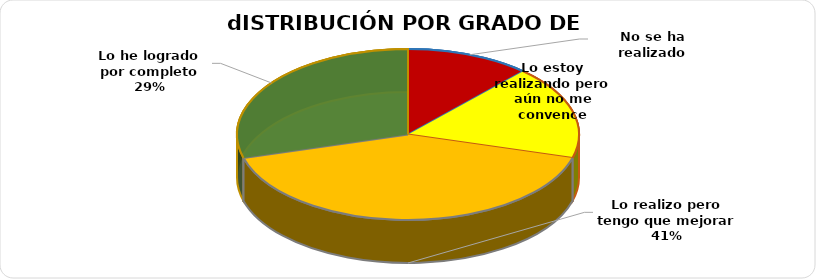
| Category | ACCIÓN |
|---|---|
| No se ha realizado | 2 |
| Lo estoy realizando pero aún no me convence | 3 |
| Lo realizo pero tengo que mejorar | 7 |
| Lo he logrado por completo | 5 |